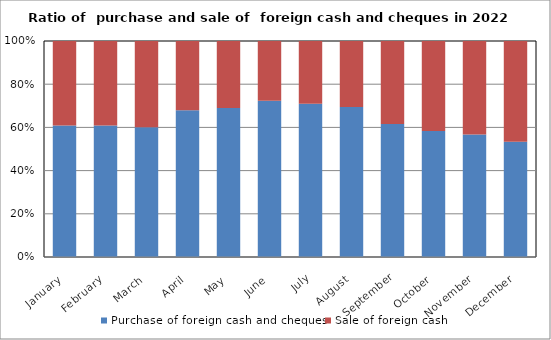
| Category | Purchase of foreign cash and cheques | Sale of foreign cash  |
|---|---|---|
| January | 841588049 | 541030108 |
| February | 874219978 | 561029169 |
| March | 1095569624 | 727658897 |
| April | 1419430407 | 669577748 |
| May | 1590976507 | 715469391 |
| June | 2220761173 | 847398673 |
| July | 2879356607 | 1176378534 |
| August | 3152443991 | 1389032922 |
| September | 1710837480 | 1066901621 |
| October | 1189684405 | 850648937 |
| November | 948384340 | 724286943 |
| December | 983045136 | 858464241 |